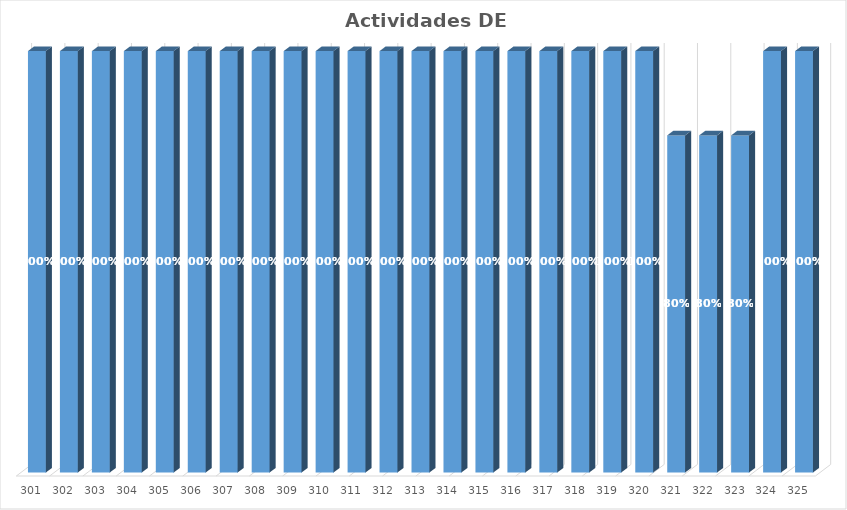
| Category | % Avance |
|---|---|
| 301.0 | 1 |
| 302.0 | 1 |
| 303.0 | 1 |
| 304.0 | 1 |
| 305.0 | 1 |
| 306.0 | 1 |
| 307.0 | 1 |
| 308.0 | 1 |
| 309.0 | 1 |
| 310.0 | 1 |
| 311.0 | 1 |
| 312.0 | 1 |
| 313.0 | 1 |
| 314.0 | 1 |
| 315.0 | 1 |
| 316.0 | 1 |
| 317.0 | 1 |
| 318.0 | 1 |
| 319.0 | 1 |
| 320.0 | 1 |
| 321.0 | 0.8 |
| 322.0 | 0.8 |
| 323.0 | 0.8 |
| 324.0 | 1 |
| 325.0 | 1 |